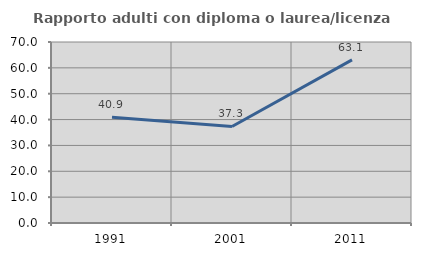
| Category | Rapporto adulti con diploma o laurea/licenza media  |
|---|---|
| 1991.0 | 40.86 |
| 2001.0 | 37.342 |
| 2011.0 | 63.077 |